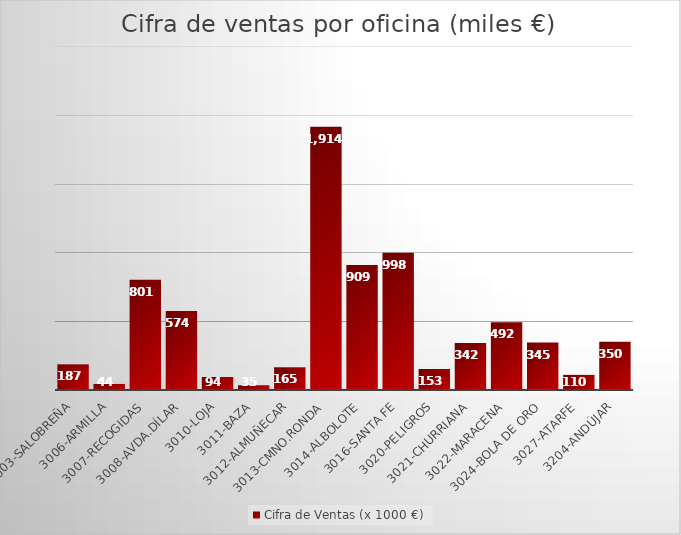
| Category | Cifra de Ventas (x 1000 €) |
|---|---|
| 3003-Salobreña | 186.5 |
| 3006-Armilla | 44 |
| 3007-Recogidas | 801 |
| 3008-Avda.Dílar | 574 |
| 3010-Loja | 94 |
| 3011-Baza | 35 |
| 3012-Almuñecar | 165 |
| 3013-Cmno.Ronda | 1913.89 |
| 3014-Albolote | 909 |
| 3016-Santa Fe | 998.19 |
| 3020-Peligros | 152.5 |
| 3021-Churriana | 342 |
| 3022-Maracena | 492 |
| 3024-Bola de Oro | 345 |
| 3027-Atarfe | 110 |
| 3204-Andújar | 350 |